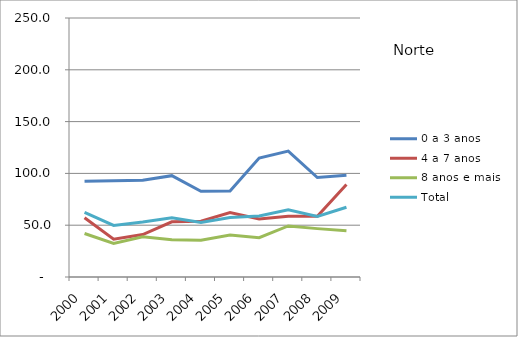
| Category | 0 a 3 anos | 4 a 7 anos | 8 anos e mais | Total |
|---|---|---|---|---|
| 2000.0 | 92.4 | 57.2 | 42 | 62.3 |
| 2001.0 | 92.8 | 36.4 | 32.3 | 49.8 |
| 2002.0 | 93.5 | 41 | 38.8 | 53.1 |
| 2003.0 | 97.8 | 53.3 | 35.9 | 57.2 |
| 2004.0 | 82.8 | 53.8 | 35.4 | 52.7 |
| 2005.0 | 82.9 | 62.2 | 40.5 | 57.5 |
| 2006.0 | 114.8 | 56.1 | 38 | 58.9 |
| 2007.0 | 121.5 | 58.7 | 49.3 | 64.8 |
| 2008.0 | 96 | 58.7 | 46.7 | 58.4 |
| 2009.0 | 98.3 | 89.3 | 44.6 | 67.3 |